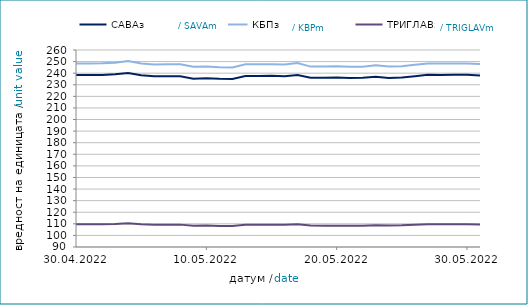
| Category | САВАз | КБПз | ТРИГЛАВз |
|---|---|---|---|
| 2022-04-30 | 238.322 | 248.326 | 109.545 |
| 2022-05-01 | 238.334 | 248.339 | 109.549 |
| 2022-05-02 | 238.499 | 248.505 | 109.59 |
| 2022-05-03 | 238.974 | 248.93 | 109.765 |
| 2022-05-04 | 240.175 | 250.506 | 110.424 |
| 2022-05-05 | 238.236 | 248.337 | 109.581 |
| 2022-05-06 | 237.262 | 247.574 | 109.289 |
| 2022-05-07 | 237.314 | 247.641 | 109.303 |
| 2022-05-08 | 237.325 | 247.654 | 109.307 |
| 2022-05-09 | 235.23 | 245.484 | 108.393 |
| 2022-05-10 | 235.725 | 245.852 | 108.468 |
| 2022-05-11 | 235.214 | 245.108 | 108.213 |
| 2022-05-12 | 235.022 | 245 | 108.193 |
| 2022-05-13 | 237.541 | 247.638 | 109.219 |
| 2022-05-14 | 237.669 | 247.797 | 109.283 |
| 2022-05-15 | 237.681 | 247.81 | 109.287 |
| 2022-05-16 | 237.332 | 247.556 | 109.251 |
| 2022-05-17 | 238.468 | 248.718 | 109.695 |
| 2022-05-18 | 236.036 | 245.678 | 108.476 |
| 2022-05-19 | 236 | 245.718 | 108.387 |
| 2022-05-20 | 236.189 | 245.907 | 108.437 |
| 2022-05-21 | 235.941 | 245.601 | 108.319 |
| 2022-05-22 | 235.953 | 245.614 | 108.323 |
| 2022-05-23 | 236.996 | 246.774 | 108.824 |
| 2022-05-24 | 235.792 | 245.731 | 108.458 |
| 2022-05-25 | 236.229 | 246.079 | 108.664 |
| 2022-05-26 | 237.416 | 247.237 | 109.15 |
| 2022-05-27 | 238.636 | 248.402 | 109.654 |
| 2022-05-28 | 238.527 | 248.258 | 109.595 |
| 2022-05-29 | 238.539 | 248.271 | 109.599 |
| 2022-05-30 | 238.654 | 248.348 | 109.638 |
| 2022-05-31 | 238.042 | 247.86 | 109.371 |